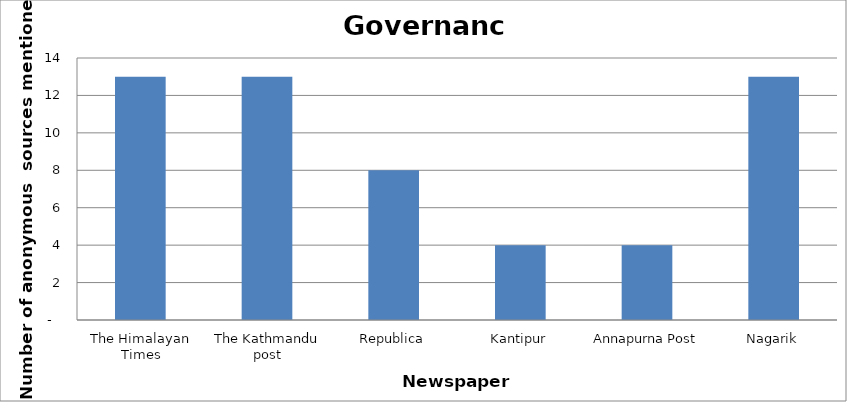
| Category | Governance |
|---|---|
| The Himalayan Times | 13 |
| The Kathmandu post | 13 |
| Republica | 8 |
| Kantipur | 4 |
| Annapurna Post | 4 |
| Nagarik | 13 |